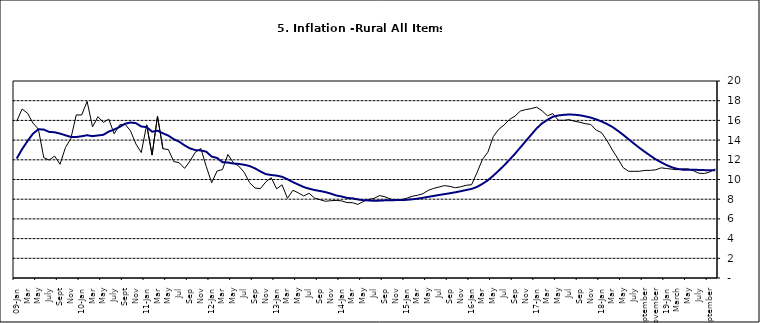
| Category | Series 0 | Series 1 |
|---|---|---|
| 09-Jan | 15.918 | 12.128 |
| Feb | 17.154 | 13.086 |
| Mar | 16.729 | 13.912 |
| Apr | 15.727 | 14.644 |
| May | 15.113 | 15.104 |
| June | 12.213 | 15.067 |
| July | 11.974 | 14.832 |
| Aug | 12.38 | 14.796 |
| Sept | 11.548 | 14.661 |
| Oct | 13.242 | 14.488 |
| Nov | 14.164 | 14.321 |
|  | 16.557 | 14.316 |
| 10-Jan | 16.548 | 14.39 |
| Feb | 17.934 | 14.494 |
| Mar | 15.346 | 14.401 |
| Apr | 16.373 | 14.473 |
| May | 15.794 | 14.54 |
| June | 16.126 | 14.862 |
| July | 14.634 | 15.072 |
| Aug | 15.556 | 15.33 |
| Sept | 15.616 | 15.658 |
| Oct | 14.955 | 15.786 |
| Nov | 13.616 | 15.719 |
| Dec | 12.735 | 15.385 |
| 11-Jan | 15.553 | 15.311 |
| Feb | 12.482 | 14.856 |
| Mar | 16.422 | 14.956 |
| Apr | 13.117 | 14.687 |
| May | 13.041 | 14.457 |
| Jun | 11.83 | 14.095 |
| Jul | 11.699 | 13.84 |
| Aug | 11.13 | 13.464 |
| Sep | 11.878 | 13.156 |
| Oct | 12.778 | 12.985 |
| Nov | 13.147 | 12.95 |
| Dec | 11.326 | 12.824 |
| 12-Jan | 9.678 | 12.33 |
| Feb | 10.856 | 12.188 |
| Mar | 11.014 | 11.76 |
| Apr | 12.536 | 11.724 |
| May | 11.712 | 11.621 |
| Jun | 11.36 | 11.582 |
| Jul | 10.733 | 11.499 |
| Aug | 9.683 | 11.368 |
| Sep | 9.132 | 11.131 |
| Oct | 9.071 | 10.82 |
| Nov | 9.758 | 10.548 |
| Dec | 10.183 | 10.455 |
| 13-Jan | 9.052 | 10.394 |
| Feb | 9.457 | 10.276 |
| Mar | 8.091 | 10.025 |
| Apr | 8.907 | 9.732 |
| May | 8.647 | 9.483 |
| Jun | 8.333 | 9.236 |
| Jul | 8.6 | 9.063 |
| Aug | 8.12 | 8.933 |
| Sep | 7.95 | 8.832 |
| Oct | 7.791 | 8.722 |
| Nov | 7.849 | 8.565 |
| Dec | 7.879 | 8.378 |
| 14-Jan | 7.832 | 8.277 |
| Feb | 7.657 | 8.13 |
| Mar | 7.65 | 8.092 |
| Apr | 7.473 | 7.973 |
| May | 7.761 | 7.901 |
| Jun | 7.98 | 7.874 |
| Jul | 8.086 | 7.834 |
| Aug | 8.368 | 7.858 |
| Sep | 8.244 | 7.883 |
| Oct | 8.019 | 7.903 |
| Nov | 7.898 | 7.906 |
| Dec | 7.955 | 7.913 |
| 15-Jan | 8.094 | 7.935 |
| Feb | 8.291 | 7.988 |
| Mar | 8.396 | 8.05 |
| Apr | 8.556 | 8.14 |
| May | 8.896 | 8.236 |
| Jun | 9.098 | 8.331 |
| Jul | 9.238 | 8.429 |
| Aug | 9.382 | 8.516 |
| Sep | 9.3 | 8.606 |
| Oct | 9.162 | 8.7 |
| Nov | 9.261 | 8.813 |
| Dec | 9.41 | 8.933 |
| 16-Jan | 9.48 | 9.047 |
| Feb | 10.692 | 9.249 |
| Mar | 12.038 | 9.559 |
| Apr | 12.767 | 9.917 |
| May | 14.349 | 10.384 |
| Jun | 15.088 | 10.897 |
| Jul | 15.533 | 11.433 |
| Aug | 16.103 | 12.002 |
| Sep | 16.428 | 12.601 |
| Oct | 16.947 | 13.25 |
| Nov | 17.099 | 13.898 |
| Dec | 17.195 | 14.54 |
| 17-Jan | 17.341 | 15.183 |
| Feb | 16.982 | 15.696 |
| Mar | 16.466 | 16.054 |
| Apr | 16.687 | 16.369 |
| May | 16.023 | 16.497 |
| Jun | 16.007 | 16.563 |
| Jul | 16.078 | 16.6 |
| Aug | 15.914 | 16.577 |
| Sep | 15.812 | 16.52 |
| Oct | 15.666 | 16.411 |
| Nov | 15.587 | 16.285 |
| Dec | 15.018 | 16.104 |
| 18-Jan | 14.756 | 15.892 |
| Feb | 13.957 | 15.638 |
| Mar | 12.987 | 15.339 |
| Apr | 12.126 | 14.95 |
| May | 11.199 | 14.53 |
| June | 10.832 | 14.083 |
| July | 10.831 | 13.636 |
| August | 10.838 | 13.209 |
| September | 10.924 | 12.804 |
| October | 10.927 | 12.418 |
| November | 10.986 | 12.049 |
| December | 11.183 | 11.746 |
| 19-Jan | 11.115 | 11.462 |
| February | 11.048 | 11.234 |
| March | 10.99 | 11.078 |
| April | 11.08 | 10.997 |
| May | 11.075 | 10.988 |
| June | 10.874 | 10.99 |
| July | 10.636 | 10.972 |
| August | 10.609 | 10.951 |
| September | 10.771 | 10.937 |
| October | 11.074 | 10.95 |